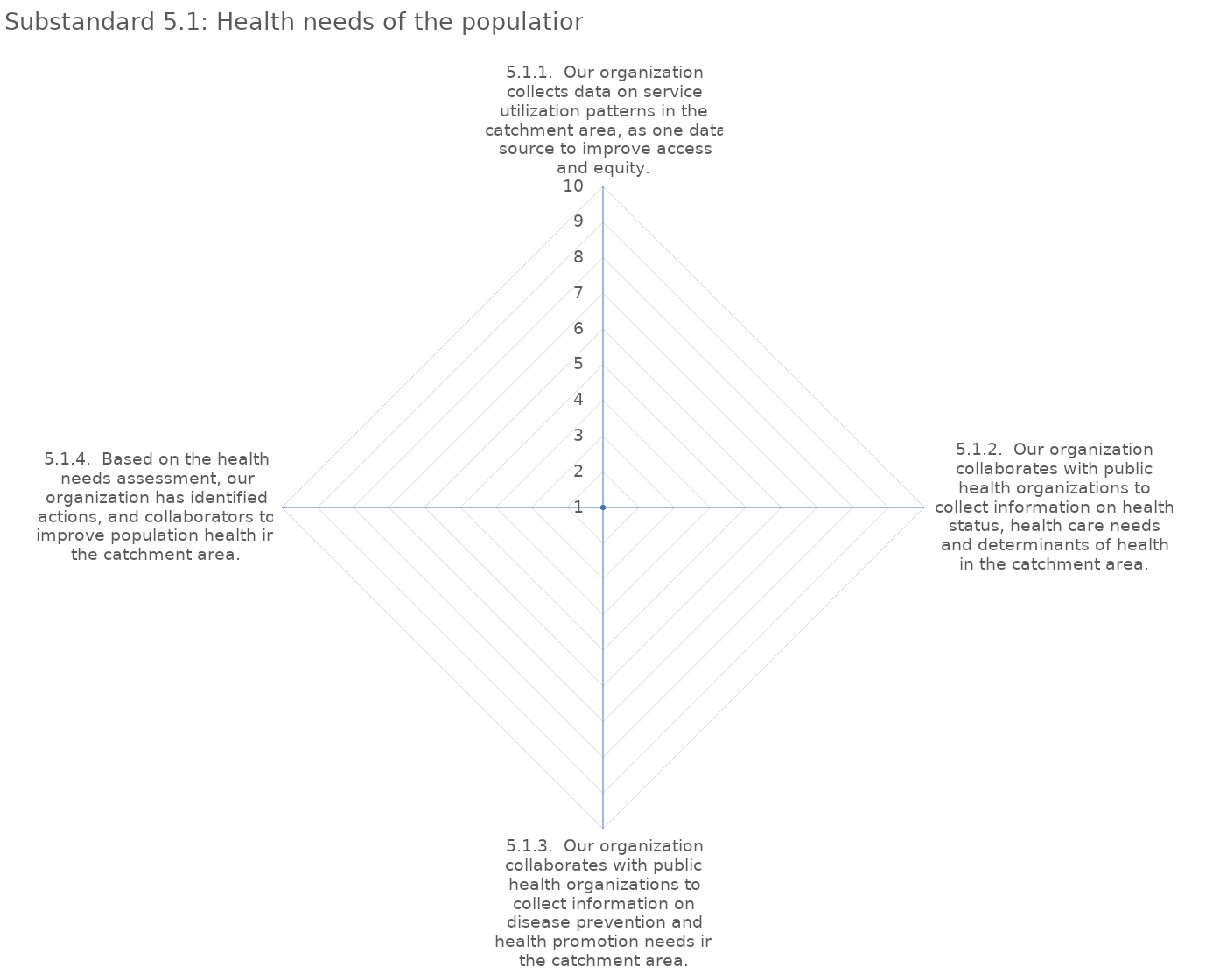
| Category | value |
|---|---|
| 5.1.1.  Our organization collects data on service utilization patterns in the catchment area, as one data source to improve access and equity. | 1 |
| 5.1.2.  Our organization collaborates with public health organizations to collect information on health status, health care needs and determinants of health in the catchment area. | 1 |
| 5.1.3.  Our organization collaborates with public health organizations to collect information on disease prevention and health promotion needs in the catchment area. | 1 |
| 5.1.4.  Based on the health needs assessment, our organization has identified actions, and collaborators to improve population health in the catchment area. | 1 |